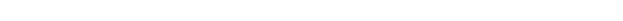
| Category | Series 0 | Series 1 | Series 2 |
|---|---|---|---|
| 0 | 0 | 0 | 0 |